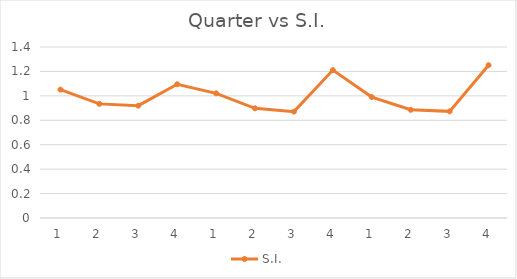
| Category | S.I. |
|---|---|
| 1.0 | 1.051 |
| 2.0 | 0.934 |
| 3.0 | 0.92 |
| 4.0 | 1.095 |
| 1.0 | 1.02 |
| 2.0 | 0.898 |
| 3.0 | 0.871 |
| 4.0 | 1.211 |
| 1.0 | 0.99 |
| 2.0 | 0.886 |
| 3.0 | 0.873 |
| 4.0 | 1.251 |